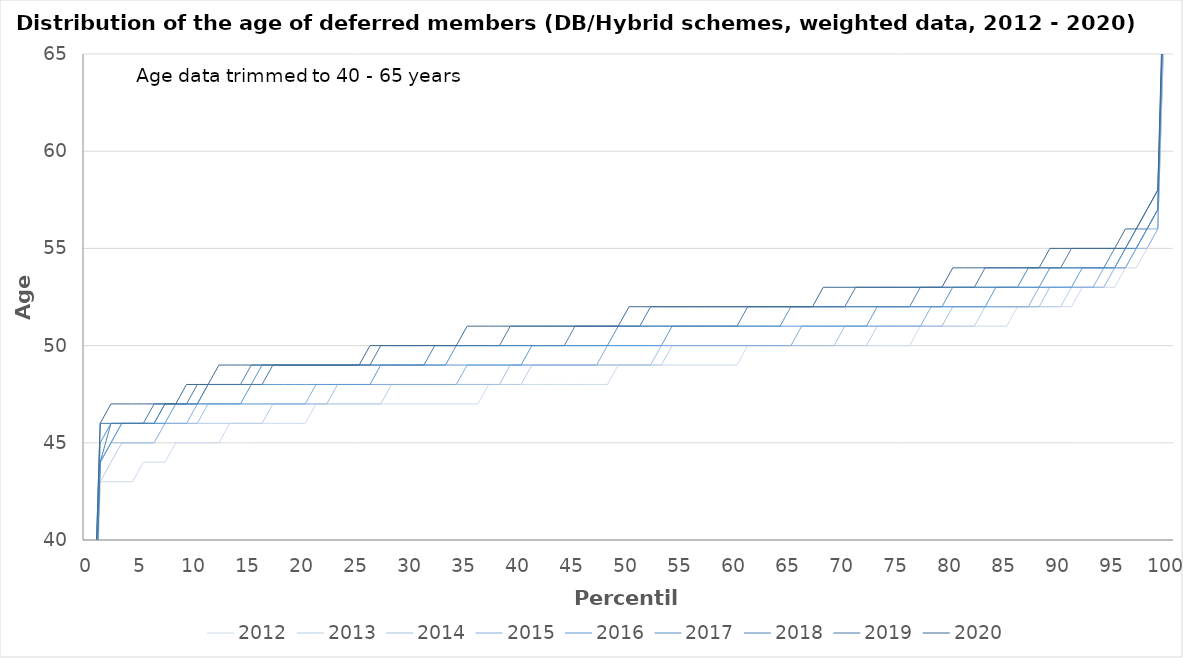
| Category | 2012 | 2013 | 2014 | 2015 | 2016 | 2017 | 2018 | 2019 | 2020 |
|---|---|---|---|---|---|---|---|---|---|
| 0.0 | 25 | 25 | 26 | 26 | 26 | 26 | 26 | 28 | 28 |
| 1.0 | 43 | 43 | 44 | 44 | 44 | 45 | 44 | 46 | 46 |
| 2.0 | 43 | 44 | 45 | 45 | 45 | 46 | 46 | 46 | 47 |
| 3.0 | 43 | 45 | 45 | 46 | 46 | 46 | 46 | 46 | 47 |
| 4.0 | 43 | 45 | 45 | 46 | 46 | 46 | 46 | 46 | 47 |
| 5.0 | 44 | 45 | 45 | 46 | 46 | 46 | 46 | 46 | 47 |
| 6.0 | 44 | 45 | 45 | 46 | 46 | 46 | 46 | 47 | 47 |
| 7.0 | 44 | 46 | 46 | 46 | 46 | 47 | 47 | 47 | 47 |
| 8.0 | 45 | 46 | 46 | 46 | 47 | 47 | 47 | 47 | 47 |
| 9.0 | 45 | 46 | 46 | 46 | 47 | 47 | 47 | 47 | 48 |
| 10.0 | 45 | 46 | 46 | 47 | 47 | 47 | 47 | 48 | 48 |
| 11.0 | 45 | 46 | 47 | 47 | 47 | 48 | 48 | 48 | 48 |
| 12.0 | 45 | 46 | 47 | 47 | 47 | 48 | 48 | 48 | 49 |
| 13.0 | 46 | 46 | 47 | 47 | 47 | 48 | 48 | 48 | 49 |
| 14.0 | 46 | 46 | 47 | 47 | 47 | 48 | 48 | 48 | 49 |
| 15.0 | 46 | 46 | 47 | 47 | 48 | 48 | 49 | 48 | 49 |
| 16.0 | 46 | 46 | 47 | 47 | 48 | 49 | 49 | 48 | 49 |
| 17.0 | 46 | 47 | 47 | 47 | 48 | 49 | 49 | 49 | 49 |
| 18.0 | 46 | 47 | 47 | 47 | 48 | 49 | 49 | 49 | 49 |
| 19.0 | 46 | 47 | 47 | 47 | 48 | 49 | 49 | 49 | 49 |
| 20.0 | 46 | 47 | 47 | 47 | 48 | 49 | 49 | 49 | 49 |
| 21.0 | 47 | 47 | 47 | 48 | 48 | 49 | 49 | 49 | 49 |
| 22.0 | 47 | 47 | 47 | 48 | 48 | 49 | 49 | 49 | 49 |
| 23.0 | 47 | 47 | 48 | 48 | 48 | 49 | 49 | 49 | 49 |
| 24.0 | 47 | 47 | 48 | 48 | 48 | 49 | 49 | 49 | 49 |
| 25.0 | 47 | 47 | 48 | 48 | 48 | 49 | 49 | 49 | 49 |
| 26.0 | 47 | 47 | 48 | 48 | 48 | 49 | 49 | 49 | 50 |
| 27.0 | 47 | 47 | 48 | 48 | 49 | 49 | 49 | 50 | 50 |
| 28.0 | 47 | 48 | 48 | 48 | 49 | 49 | 49 | 50 | 50 |
| 29.0 | 47 | 48 | 48 | 48 | 49 | 49 | 49 | 50 | 50 |
| 30.0 | 47 | 48 | 48 | 48 | 49 | 49 | 49 | 50 | 50 |
| 31.0 | 47 | 48 | 48 | 48 | 49 | 49 | 49 | 50 | 50 |
| 32.0 | 47 | 48 | 48 | 48 | 49 | 49 | 50 | 50 | 50 |
| 33.0 | 47 | 48 | 48 | 48 | 49 | 49 | 50 | 50 | 50 |
| 34.0 | 47 | 48 | 48 | 48 | 49 | 50 | 50 | 50 | 50 |
| 35.0 | 47 | 48 | 48 | 49 | 49 | 50 | 50 | 50 | 51 |
| 36.0 | 47 | 48 | 48 | 49 | 49 | 50 | 50 | 50 | 51 |
| 37.0 | 48 | 48 | 48 | 49 | 49 | 50 | 50 | 50 | 51 |
| 38.0 | 48 | 48 | 48 | 49 | 49 | 50 | 50 | 50 | 51 |
| 39.0 | 48 | 48 | 49 | 49 | 49 | 50 | 50 | 51 | 51 |
| 40.0 | 48 | 48 | 49 | 49 | 49 | 50 | 50 | 51 | 51 |
| 41.0 | 48 | 49 | 49 | 49 | 50 | 50 | 50 | 51 | 51 |
| 42.0 | 48 | 49 | 49 | 49 | 50 | 50 | 50 | 51 | 51 |
| 43.0 | 48 | 49 | 49 | 49 | 50 | 50 | 50 | 51 | 51 |
| 44.0 | 48 | 49 | 49 | 49 | 50 | 50 | 50 | 51 | 51 |
| 45.0 | 48 | 49 | 49 | 49 | 50 | 50 | 51 | 51 | 51 |
| 46.0 | 48 | 49 | 49 | 49 | 50 | 50 | 51 | 51 | 51 |
| 47.0 | 48 | 49 | 49 | 49 | 50 | 50 | 51 | 51 | 51 |
| 48.0 | 48 | 49 | 49 | 50 | 50 | 50 | 51 | 51 | 51 |
| 49.0 | 49 | 49 | 49 | 50 | 50 | 51 | 51 | 51 | 51 |
| 50.0 | 49 | 49 | 49 | 50 | 50 | 51 | 51 | 51 | 52 |
| 51.0 | 49 | 49 | 49 | 50 | 50 | 51 | 51 | 51 | 52 |
| 52.0 | 49 | 49 | 49 | 50 | 50 | 51 | 51 | 52 | 52 |
| 53.0 | 49 | 49 | 50 | 50 | 50 | 51 | 51 | 52 | 52 |
| 54.0 | 49 | 50 | 50 | 50 | 51 | 51 | 51 | 52 | 52 |
| 55.0 | 49 | 50 | 50 | 50 | 51 | 51 | 51 | 52 | 52 |
| 56.0 | 49 | 50 | 50 | 50 | 51 | 51 | 51 | 52 | 52 |
| 57.0 | 49 | 50 | 50 | 50 | 51 | 51 | 51 | 52 | 52 |
| 58.0 | 49 | 50 | 50 | 50 | 51 | 51 | 51 | 52 | 52 |
| 59.0 | 49 | 50 | 50 | 50 | 51 | 51 | 51 | 52 | 52 |
| 60.0 | 49 | 50 | 50 | 50 | 51 | 51 | 51 | 52 | 52 |
| 61.0 | 50 | 50 | 50 | 50 | 51 | 51 | 52 | 52 | 52 |
| 62.0 | 50 | 50 | 50 | 50 | 51 | 51 | 52 | 52 | 52 |
| 63.0 | 50 | 50 | 50 | 50 | 51 | 51 | 52 | 52 | 52 |
| 64.0 | 50 | 50 | 50 | 50 | 51 | 51 | 52 | 52 | 52 |
| 65.0 | 50 | 50 | 50 | 50 | 51 | 52 | 52 | 52 | 52 |
| 66.0 | 50 | 50 | 50 | 51 | 51 | 52 | 52 | 52 | 52 |
| 67.0 | 50 | 50 | 50 | 51 | 51 | 52 | 52 | 52 | 52 |
| 68.0 | 50 | 50 | 50 | 51 | 51 | 52 | 52 | 52 | 53 |
| 69.0 | 50 | 50 | 50 | 51 | 51 | 52 | 52 | 52 | 53 |
| 70.0 | 50 | 50 | 51 | 51 | 51 | 52 | 52 | 52 | 53 |
| 71.0 | 50 | 50 | 51 | 51 | 51 | 52 | 52 | 53 | 53 |
| 72.0 | 50 | 50 | 51 | 51 | 51 | 52 | 52 | 53 | 53 |
| 73.0 | 50 | 51 | 51 | 51 | 52 | 52 | 52 | 53 | 53 |
| 74.0 | 50 | 51 | 51 | 51 | 52 | 52 | 52 | 53 | 53 |
| 75.0 | 50 | 51 | 51 | 51 | 52 | 52 | 52 | 53 | 53 |
| 76.0 | 50 | 51 | 51 | 51 | 52 | 52 | 52 | 53 | 53 |
| 77.0 | 51 | 51 | 51 | 51 | 52 | 52 | 53 | 53 | 53 |
| 78.0 | 51 | 51 | 51 | 52 | 52 | 52 | 53 | 53 | 53 |
| 79.0 | 51 | 51 | 51 | 52 | 52 | 52 | 53 | 53 | 53 |
| 80.0 | 51 | 51 | 52 | 52 | 52 | 53 | 53 | 53 | 54 |
| 81.0 | 51 | 51 | 52 | 52 | 52 | 53 | 53 | 53 | 54 |
| 82.0 | 51 | 51 | 52 | 52 | 52 | 53 | 53 | 53 | 54 |
| 83.0 | 51 | 52 | 52 | 52 | 52 | 53 | 53 | 54 | 54 |
| 84.0 | 51 | 52 | 52 | 52 | 53 | 53 | 53 | 54 | 54 |
| 85.0 | 51 | 52 | 52 | 52 | 53 | 53 | 53 | 54 | 54 |
| 86.0 | 52 | 52 | 52 | 52 | 53 | 53 | 53 | 54 | 54 |
| 87.0 | 52 | 52 | 52 | 52 | 53 | 53 | 54 | 54 | 54 |
| 88.0 | 52 | 52 | 52 | 53 | 53 | 53 | 54 | 54 | 54 |
| 89.0 | 52 | 52 | 53 | 53 | 53 | 54 | 54 | 54 | 55 |
| 90.0 | 52 | 52 | 53 | 53 | 53 | 54 | 54 | 54 | 55 |
| 91.0 | 52 | 53 | 53 | 53 | 53 | 54 | 54 | 55 | 55 |
| 92.0 | 53 | 53 | 53 | 53 | 54 | 54 | 54 | 55 | 55 |
| 93.0 | 53 | 53 | 53 | 53 | 54 | 54 | 54 | 55 | 55 |
| 94.0 | 53 | 53 | 53 | 54 | 54 | 54 | 54 | 55 | 55 |
| 95.0 | 53 | 54 | 54 | 54 | 54 | 54 | 55 | 55 | 55 |
| 96.0 | 54 | 54 | 54 | 54 | 55 | 55 | 55 | 55 | 56 |
| 97.0 | 54 | 55 | 55 | 55 | 55 | 55 | 56 | 56 | 56 |
| 98.0 | 55 | 55 | 55 | 56 | 56 | 56 | 56 | 57 | 57 |
| 99.0 | 56 | 56 | 56 | 56 | 57 | 57 | 57 | 58 | 58 |
| 100.0 | 74 | 74 | 74 | 78 | 78 | 78 | 77 | 77 | 79 |